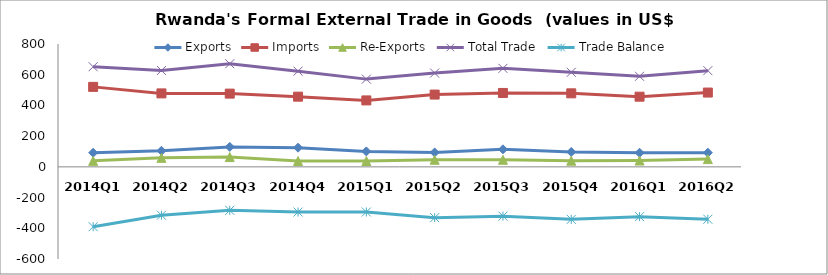
| Category | Exports | Imports | Re-Exports | Total Trade | Trade Balance |
|---|---|---|---|---|---|
| 2014Q1 | 92.155 | 520.838 | 39.039 | 652.033 | -389.643 |
| 2014Q2 | 104.739 | 478.379 | 58.742 | 627.5 | -314.898 |
| 2014Q3 | 129.946 | 476.955 | 63.929 | 671.52 | -283.08 |
| 2014Q4 | 124.747 | 457.048 | 38.092 | 623.245 | -294.209 |
| 2015Q1 | 100.645 | 432.606 | 38.092 | 571.343 | -293.87 |
| 2015Q2 | 93.892 | 470.703 | 46.126 | 610.721 | -330.685 |
| 2015Q3 | 114.24 | 481.145 | 46.053 | 641.438 | -320.853 |
| 2015Q4 | 97.026 | 478.754 | 39.897 | 615.677 | -341.831 |
| 2016Q1 | 91.795 | 456.929 | 41.031 | 589.755 | -324.103 |
| 2016Q2 | 92.237 | 483.863 | 50.433 | 626.533 | -341.192 |